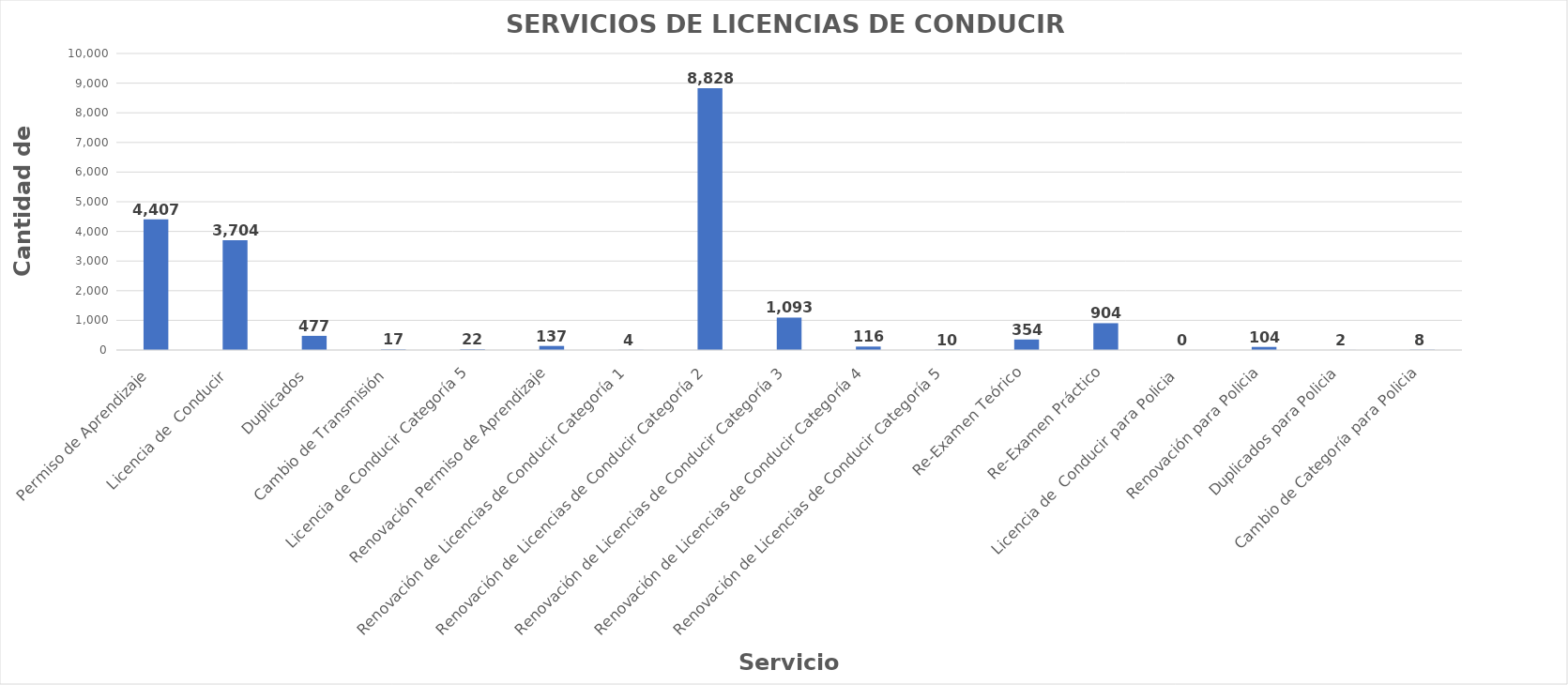
| Category | Series 0 |
|---|---|
| Permiso de Aprendizaje  | 4407 |
| Licencia de  Conducir  | 3704 |
| Duplicados  | 477 |
| Cambio de Transmisión  | 17 |
| Licencia de Conducir Categoría 5 | 22 |
| Renovación Permiso de Aprendizaje | 137 |
| Renovación de Licencias de Conducir Categoría 1 | 4 |
| Renovación de Licencias de Conducir Categoría 2 | 8828 |
| Renovación de Licencias de Conducir Categoría 3 | 1093 |
| Renovación de Licencias de Conducir Categoría 4 | 116 |
| Renovación de Licencias de Conducir Categoría 5 | 10 |
| Re-Examen Teórico | 354 |
| Re-Examen Práctico | 904 |
| Licencia de  Conducir para Policia  | 0 |
| Renovación para Policia | 104 |
| Duplicados para Policia | 2 |
| Cambio de Categoría para Policia | 8 |